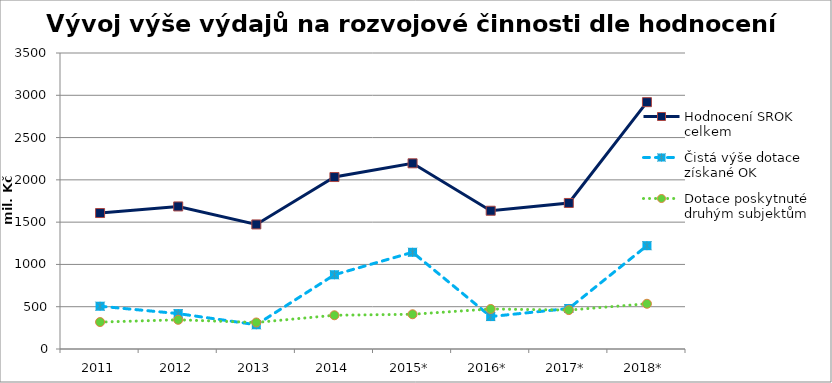
| Category | Hodnocení SROK celkem | Čistá výše dotace získané OK | Dotace poskytnuté druhým subjektům |
|---|---|---|---|
| 2011 | 1607638 | 505857 | 318555 |
| 2012 | 1685842 | 418589 | 345101 |
| 2013 | 1472887 | 286508 | 313709 |
| 2014 | 2033395 | 877745 | 398848 |
| 2015* | 2195630 | 1143591 | 410739 |
| 2016* | 1634844 | 383485 | 473283 |
| 2017* | 1726818 | 479135 | 459998 |
| 2018* | 2918731 | 1221663 | 534714 |